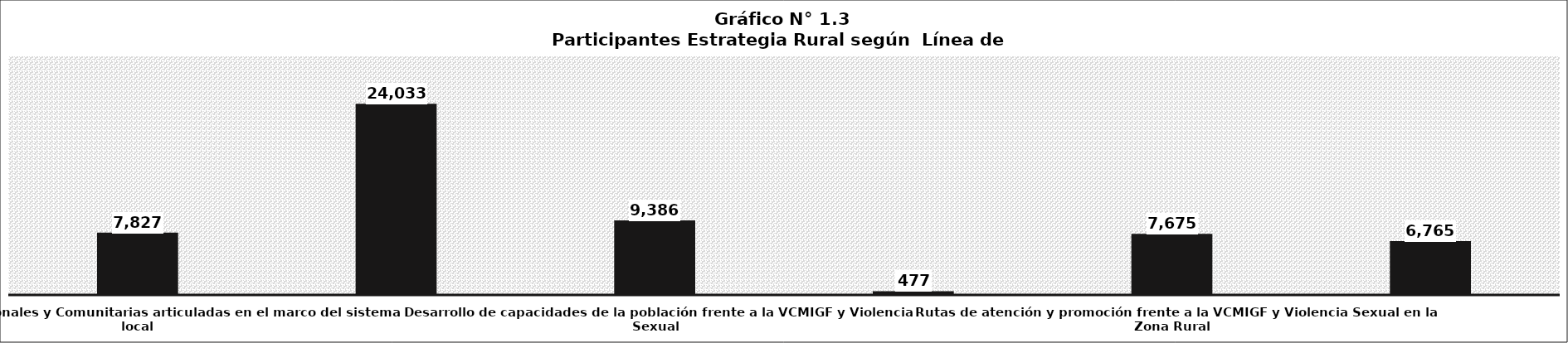
| Category | Series 0 |
|---|---|
| Redes Insititucionales y Comunitarias articuladas en el marco del sistema local | 7827 |
| Movilización social para enfrentar la VCMIGF y Violencia Sexual en zonas rurales | 24033 |
| Desarrollo de capacidades de la población frente a la VCMIGF y Violencia Sexual | 9386 |
| Fortalecer la organización comunal para la vigilancia frente a la VCMIGF y Violencia Sexual en zonas rurales | 477 |
| Rutas de atención y promoción frente a la VCMIGF y Violencia Sexual en la Zona Rural | 7675 |
| Fortalecimiento de capacidades de los operadores de atención y prevención de la VCMIGF y Violencia Sexual en los niveles provinciales, distritales y comunal | 6765 |